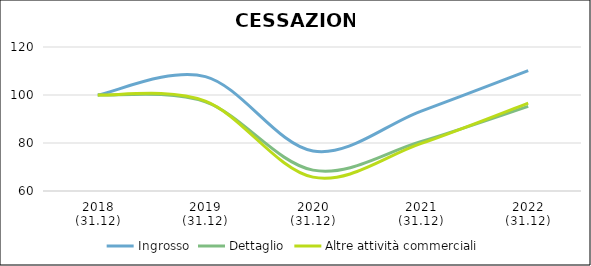
| Category | Ingrosso | Dettaglio | Altre attività commerciali |
|---|---|---|---|
| 2018
(31.12) | 100 | 100 | 100 |
| 2019
(31.12) | 107.664 | 97.138 | 97.428 |
| 2020
(31.12) | 76.674 | 68.695 | 65.783 |
| 2021
(31.12) | 93.202 | 80.57 | 79.735 |
| 2022
(31.12) | 110.13 | 95.268 | 96.648 |